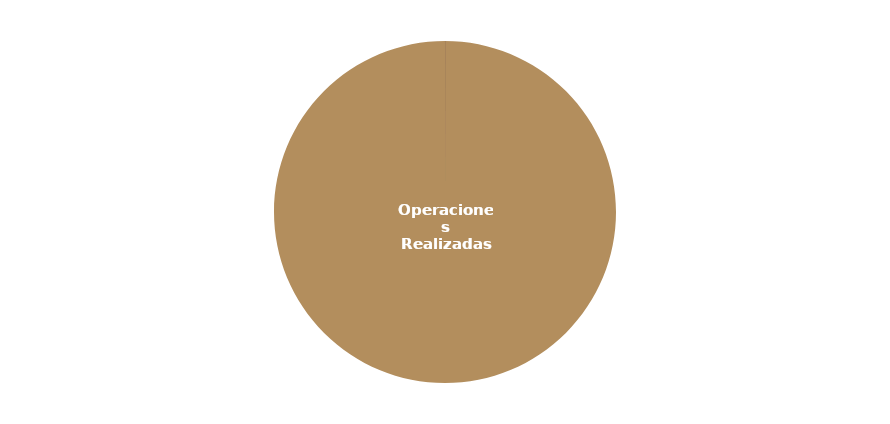
| Category | Cancelaciones |
|---|---|
| Operaciones Realizadas | 19098 |
|    Operaciones Aerolinea* | 0 |
|    Mantenimiento Aeronaves* | 0 |
|    Otras Imputables | 0 |
|    Meteorologia | 0 |
|    Otras No Imputables | 0 |